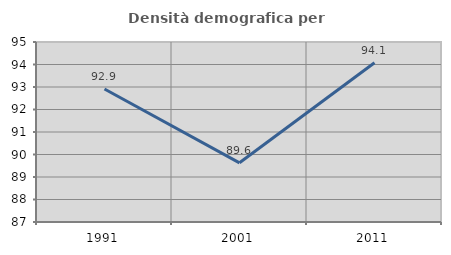
| Category | Densità demografica |
|---|---|
| 1991.0 | 92.912 |
| 2001.0 | 89.631 |
| 2011.0 | 94.075 |